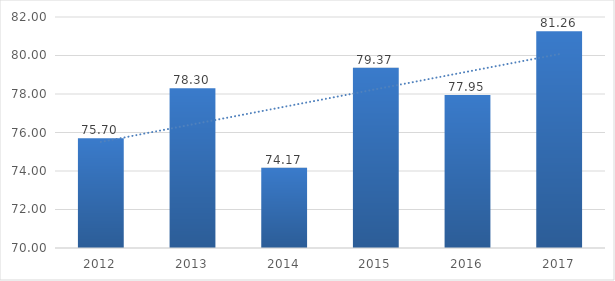
| Category | Series 0 |
|---|---|
| 2012.0 | 75.7 |
| 2013.0 | 78.3 |
| 2014.0 | 74.17 |
| 2015.0 | 79.37 |
| 2016.0 | 77.95 |
| 2017.0 | 81.26 |